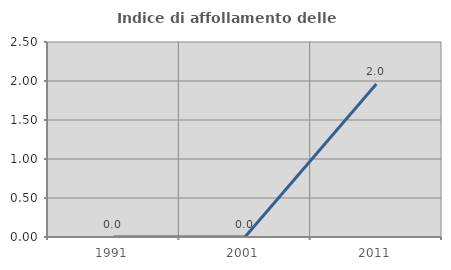
| Category | Indice di affollamento delle abitazioni  |
|---|---|
| 1991.0 | 0 |
| 2001.0 | 0 |
| 2011.0 | 1.961 |